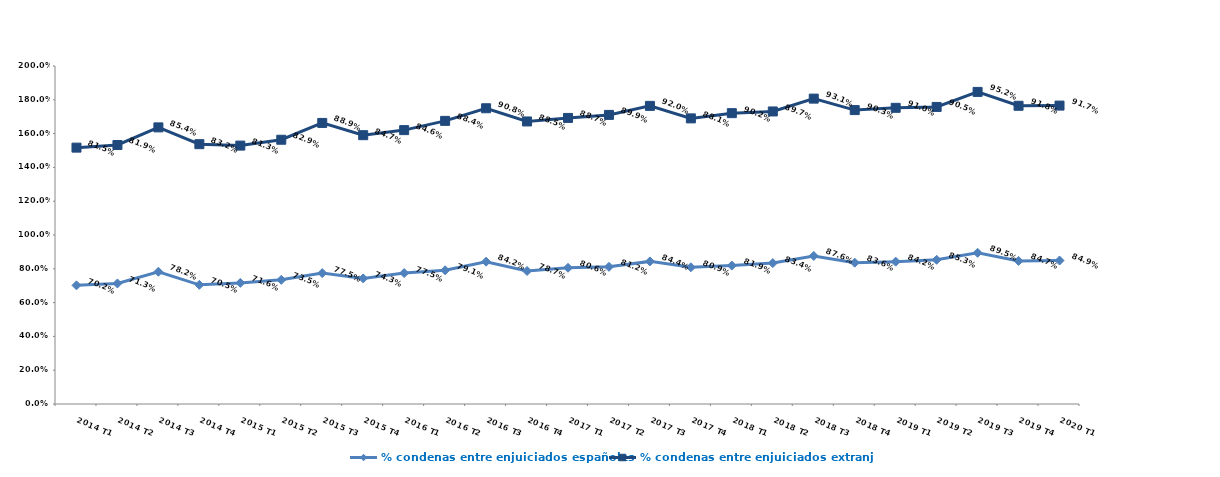
| Category | % condenas entre enjuiciados españoles | % condenas entre enjuiciados extranjeros |
|---|---|---|
| 2014 T1 | 0.702 | 0.815 |
| 2014 T2 | 0.713 | 0.819 |
| 2014 T3 | 0.782 | 0.854 |
| 2014 T4 | 0.705 | 0.832 |
| 2015 T1 | 0.716 | 0.812 |
| 2015 T2 | 0.735 | 0.829 |
| 2015 T3 | 0.775 | 0.889 |
| 2015 T4 | 0.743 | 0.847 |
| 2016 T1 | 0.775 | 0.846 |
| 2016 T2 | 0.791 | 0.884 |
| 2016 T3 | 0.842 | 0.908 |
| 2016 T4 | 0.787 | 0.885 |
| 2017 T1 | 0.806 | 0.887 |
| 2017 T2 | 0.812 | 0.899 |
| 2017 T3 | 0.844 | 0.92 |
| 2017 T4 | 0.809 | 0.881 |
| 2018 T1 | 0.819 | 0.902 |
| 2018 T2 | 0.834 | 0.897 |
| 2018 T3 | 0.876 | 0.931 |
| 2018 T4 | 0.836 | 0.903 |
| 2019 T1 | 0.842 | 0.91 |
| 2019 T2 | 0.853 | 0.905 |
| 2019 T3 | 0.895 | 0.952 |
| 2019 T4 | 0.847 | 0.918 |
| 2020 T1 | 0.849 | 0.917 |